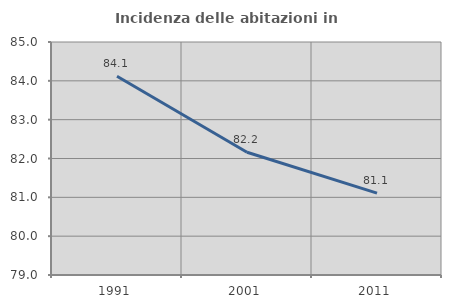
| Category | Incidenza delle abitazioni in proprietà  |
|---|---|
| 1991.0 | 84.119 |
| 2001.0 | 82.16 |
| 2011.0 | 81.108 |